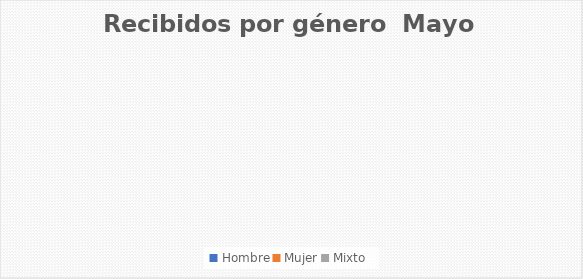
| Category | Recibidos por género  Mayo |
|---|---|
| Hombre | 0 |
| Mujer | 0 |
| Mixto | 0 |